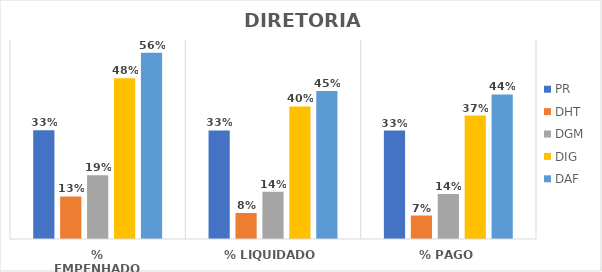
| Category | PR | DHT | DGM | DIG | DAF |
|---|---|---|---|---|---|
| % EMPENHADO | 0.328 | 0.128 | 0.192 | 0.484 | 0.561 |
| % LIQUIDADO | 0.327 | 0.078 | 0.143 | 0.4 | 0.447 |
| % PAGO | 0.327 | 0.071 | 0.136 | 0.372 | 0.436 |